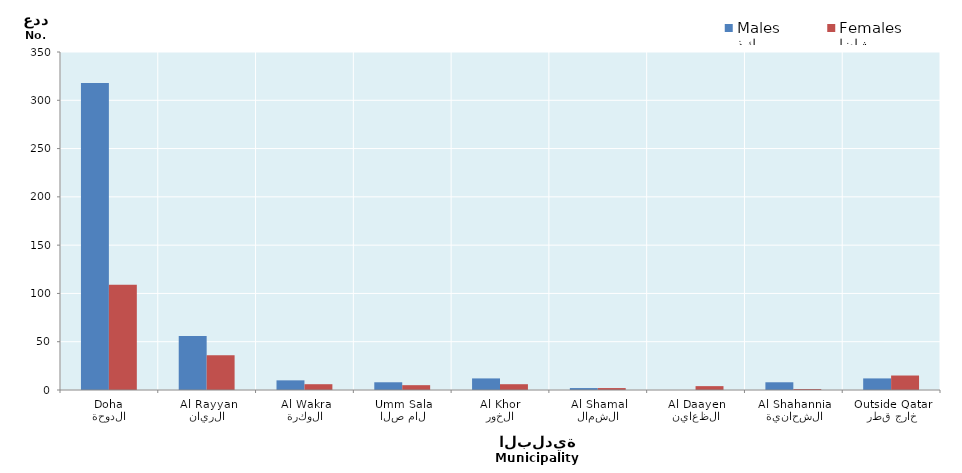
| Category | ذكور
Males | إناث
Females |
|---|---|---|
| الدوحة
Doha | 318 | 109 |
| الريان
Al Rayyan | 56 | 36 |
| الوكرة
Al Wakra | 10 | 6 |
| ام صلال
Umm Salal | 8 | 5 |
| الخور
Al Khor | 12 | 6 |
| الشمال
Al Shamal | 2 | 2 |
| الظعاين
Al Daayen | 0 | 4 |
| الشحانية
Al Shahannia | 8 | 1 |
| خارج قطر
Outside Qatar | 12 | 15 |